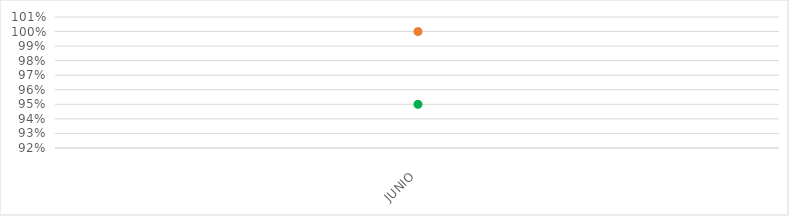
| Category | VALOR  | META PONDERADA |
|---|---|---|
| JUNIO | 1 | 0.95 |